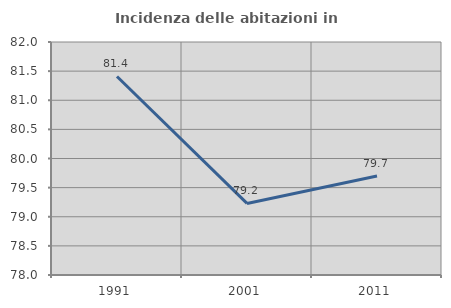
| Category | Incidenza delle abitazioni in proprietà  |
|---|---|
| 1991.0 | 81.408 |
| 2001.0 | 79.229 |
| 2011.0 | 79.699 |